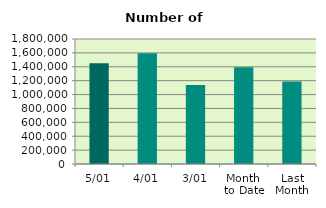
| Category | Series 0 |
|---|---|
| 5/01 | 1452502 |
| 4/01 | 1593152 |
| 3/01 | 1137552 |
| Month 
to Date | 1394402 |
| Last
Month | 1187425.652 |